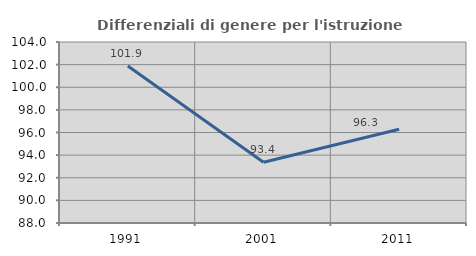
| Category | Differenziali di genere per l'istruzione superiore |
|---|---|
| 1991.0 | 101.882 |
| 2001.0 | 93.37 |
| 2011.0 | 96.281 |